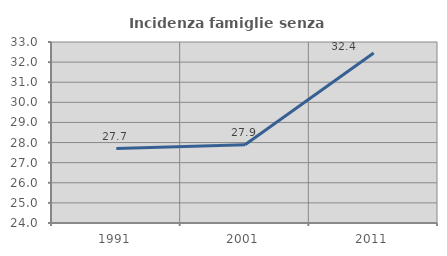
| Category | Incidenza famiglie senza nuclei |
|---|---|
| 1991.0 | 27.699 |
| 2001.0 | 27.889 |
| 2011.0 | 32.45 |